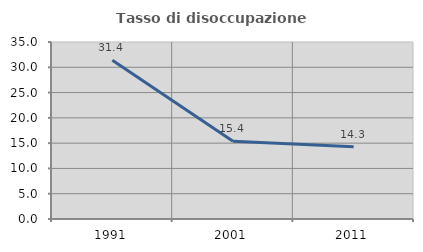
| Category | Tasso di disoccupazione giovanile  |
|---|---|
| 1991.0 | 31.373 |
| 2001.0 | 15.385 |
| 2011.0 | 14.286 |